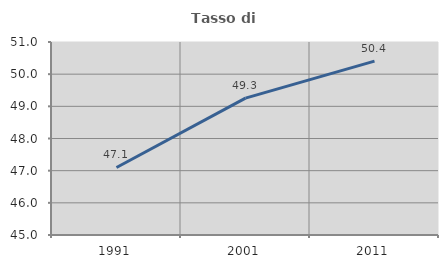
| Category | Tasso di occupazione   |
|---|---|
| 1991.0 | 47.099 |
| 2001.0 | 49.254 |
| 2011.0 | 50.405 |